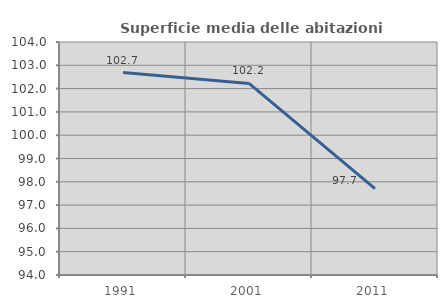
| Category | Superficie media delle abitazioni occupate |
|---|---|
| 1991.0 | 102.69 |
| 2001.0 | 102.223 |
| 2011.0 | 97.71 |